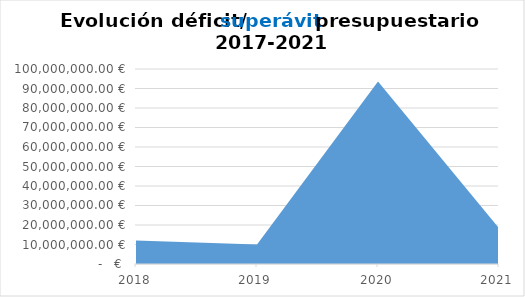
| Category | Evolución déficit presupuestario |
|---|---|
| 2018.0 | 12113501.08 |
| 2019.0 | 10026017.243 |
| 2020.0 | 93533986.98 |
| 2021.0 | 18388077.01 |